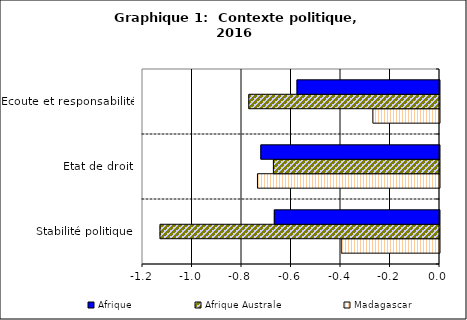
| Category | Madagascar | Afrique Australe | Afrique |
|---|---|---|---|
| Stabilité politique | -0.397 | -1.129 | -0.667 |
| Etat de droit | -0.736 | -0.671 | -0.722 |
| Ecoute et responsabilité | -0.269 | -0.771 | -0.576 |